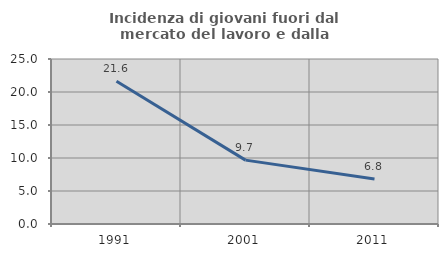
| Category | Incidenza di giovani fuori dal mercato del lavoro e dalla formazione  |
|---|---|
| 1991.0 | 21.622 |
| 2001.0 | 9.677 |
| 2011.0 | 6.818 |